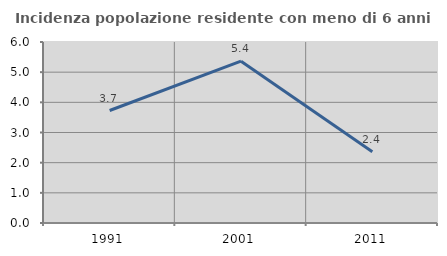
| Category | Incidenza popolazione residente con meno di 6 anni |
|---|---|
| 1991.0 | 3.729 |
| 2001.0 | 5.363 |
| 2011.0 | 2.362 |